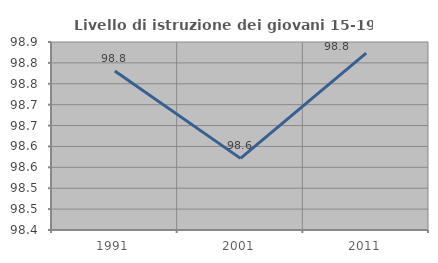
| Category | Livello di istruzione dei giovani 15-19 anni |
|---|---|
| 1991.0 | 98.78 |
| 2001.0 | 98.571 |
| 2011.0 | 98.824 |